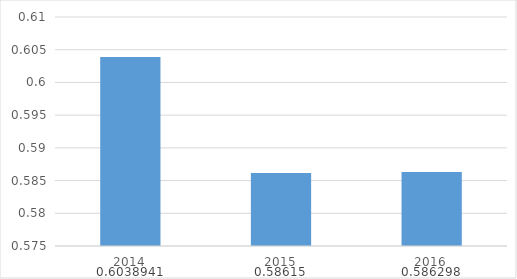
| Category | Коэффициент быстрой ликвидности |
|---|---|
| 2014.0 | 0.604 |
| 2015.0 | 0.586 |
| 2016.0 | 0.586 |